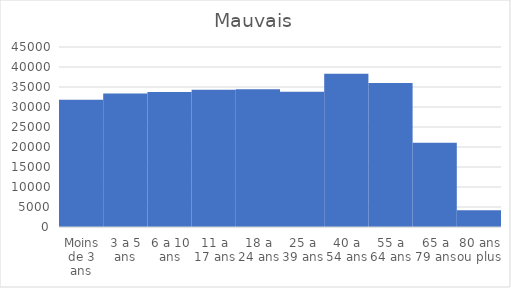
| Category | Series 0 |
|---|---|
| Moins de 3 ans | 31817.667 |
| 3 а 5 ans | 33371 |
| 6 а 10 ans | 33768.8 |
| 11 а 17 ans | 34320.429 |
| 18 а 24 ans | 34456.286 |
| 25 а 39 ans | 33813.933 |
| 40 а 54 ans | 38314 |
| 55 а 64 ans | 35985.5 |
| 65 а 79 ans | 21082.733 |
| 80 ans ou plus | 4187.84 |